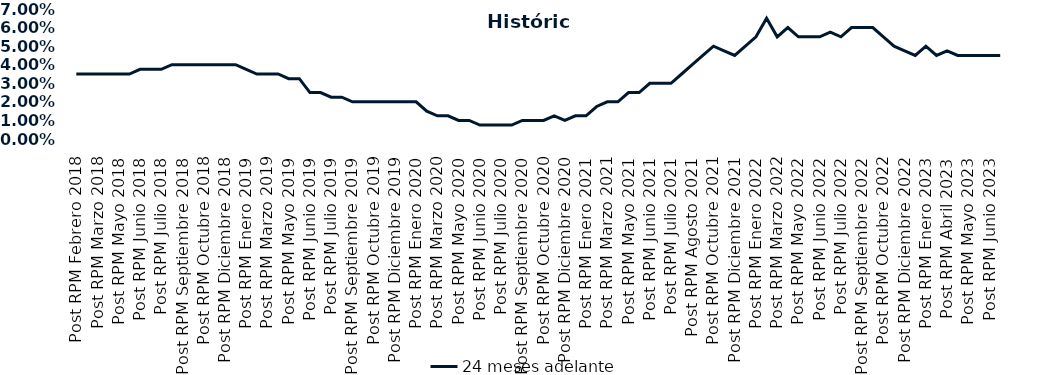
| Category | 24 meses adelante  |
|---|---|
| Post RPM Febrero 2018 | 0.035 |
| Pre RPM Marzo 2018 | 0.035 |
| Post RPM Marzo 2018 | 0.035 |
| Pre RPM Mayo 2018 | 0.035 |
| Post RPM Mayo 2018 | 0.035 |
| Pre RPM Junio 2018 | 0.035 |
| Post RPM Junio 2018 | 0.038 |
| Pre RPM Julio 2018 | 0.038 |
| Post RPM Julio 2018 | 0.038 |
| Pre RPM Septiembre 2018 | 0.04 |
| Post RPM Septiembre 2018 | 0.04 |
| Pre RPM Octubre 2018 | 0.04 |
| Post RPM Octubre 2018 | 0.04 |
| Pre RPM Diciembre 2018 | 0.04 |
| Post RPM Diciembre 2018 | 0.04 |
| Pre RPM Enero 2019 | 0.04 |
| Post RPM Enero 2019 | 0.038 |
| Pre RPM Marzo 2019 | 0.035 |
| Post RPM Marzo 2019 | 0.035 |
| Pre RPM Mayo 2019 | 0.035 |
| Post RPM Mayo 2019 | 0.032 |
| Pre RPM Junio 2019 | 0.032 |
| Post RPM Junio 2019 | 0.025 |
| Pre RPM Julio 2019 | 0.025 |
| Post RPM Julio 2019 | 0.022 |
| Pre RPM Septiembre 2019 | 0.022 |
| Post RPM Septiembre 2019 | 0.02 |
| Pre RPM Octubre 2019 | 0.02 |
| Post RPM Octubre 2019 | 0.02 |
| Pre RPM Diciembre 2019 | 0.02 |
| Post RPM Diciembre 2019 | 0.02 |
| Pre RPM Enero 2020 | 0.02 |
| Post RPM Enero 2020 | 0.02 |
| Pre RPM Marzo 2020 | 0.015 |
| Post RPM Marzo 2020 | 0.012 |
| Pre RPM Mayo 2020 | 0.012 |
| Post RPM Mayo 2020 | 0.01 |
| Pre RPM Junio 2020 | 0.01 |
| Post RPM Junio 2020 | 0.008 |
| Pre RPM Julio 2020 | 0.008 |
| Post RPM Julio 2020 | 0.008 |
| Pre RPM Septiembre 2020 | 0.008 |
| Post RPM Septiembre 2020 | 0.01 |
| Pre RPM Octubre 2020 | 0.01 |
| Post RPM Octubre 2020 | 0.01 |
| Pre RPM Diciembre 2020 | 0.012 |
| Post RPM Diciembre 2020 | 0.01 |
| Pre RPM Enero 2021 | 0.012 |
| Post RPM Enero 2021 | 0.012 |
| Pre RPM Marzo 2021 | 0.018 |
| Post RPM Marzo 2021 | 0.02 |
| Pre RPM Mayo 2021 | 0.02 |
| Post RPM Mayo 2021 | 0.025 |
| Pre RPM Junio 2021 | 0.025 |
| Post RPM Junio 2021 | 0.03 |
| Pre RPM Julio 2021 | 0.03 |
| Post RPM Julio 2021 | 0.03 |
| Pre RPM Agosto 2021 | 0.035 |
| Post RPM Agosto 2021 | 0.04 |
| Pre RPM Octubre 2021 | 0.045 |
| Post RPM Octubre 2021 | 0.05 |
| Pre RPM Diciembre 2021 | 0.048 |
| Post RPM Diciembre 2021 | 0.045 |
| Pre RPM Enero 2022 | 0.05 |
| Post RPM Enero 2022 | 0.055 |
| Pre RPM Marzo 2022 | 0.065 |
| Post RPM Marzo 2022 | 0.055 |
| Pre RPM Mayo 2022 | 0.06 |
| Post RPM Mayo 2022 | 0.055 |
| Pre RPM Junio 2022 | 0.055 |
| Post RPM Junio 2022 | 0.055 |
| Pre RPM Julio 2022 | 0.058 |
| Post RPM Julio 2022 | 0.055 |
| Pre RPM Septiembre 2022 | 0.06 |
| Post RPM Septiembre 2022 | 0.06 |
| Pre RPM Octubre 2022 | 0.06 |
| Post RPM Octubre 2022 | 0.055 |
| Pre RPM Diciembre 2022 | 0.05 |
| Post RPM Diciembre 2022 | 0.048 |
| Pre RPM Enero 2023 | 0.045 |
| Post RPM Enero 2023 | 0.05 |
| Pre RPM Abril 2023 | 0.045 |
| Post RPM Abril 2023 | 0.048 |
| Pre RPM Mayo 2023 | 0.045 |
| Post RPM Mayo 2023 | 0.045 |
| Pre RPM Junio 2023 | 0.045 |
| Post RPM Junio 2023 | 0.045 |
| Pre RPM Julio 2023 | 0.045 |